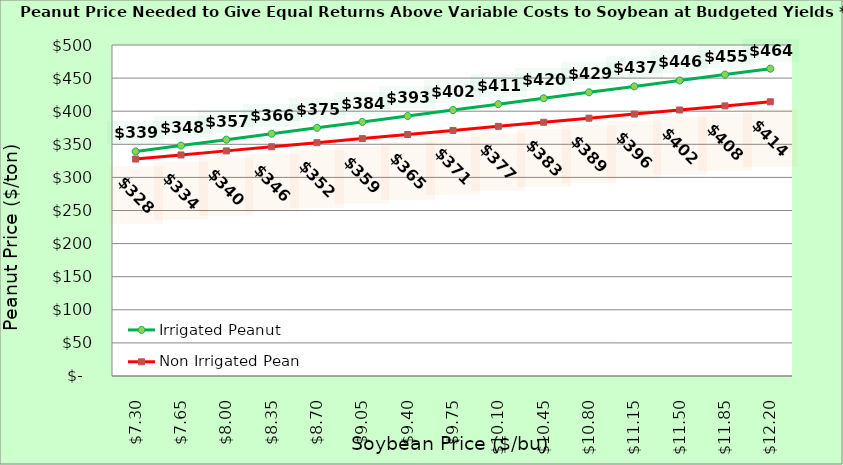
| Category | Irrigated Peanut | Non Irrigated Peanut |
|---|---|---|
| 7.3000000000000025 | 339.147 | 327.711 |
| 7.650000000000002 | 348.083 | 333.887 |
| 8.000000000000002 | 357.019 | 340.064 |
| 8.350000000000001 | 365.955 | 346.24 |
| 8.700000000000001 | 374.892 | 352.417 |
| 9.05 | 383.828 | 358.593 |
| 9.4 | 392.764 | 364.77 |
| 9.75 | 401.7 | 370.946 |
| 10.1 | 410.636 | 377.123 |
| 10.45 | 419.573 | 383.299 |
| 10.799999999999999 | 428.509 | 389.476 |
| 11.149999999999999 | 437.445 | 395.652 |
| 11.499999999999998 | 446.381 | 401.828 |
| 11.849999999999998 | 455.317 | 408.005 |
| 12.199999999999998 | 464.253 | 414.181 |